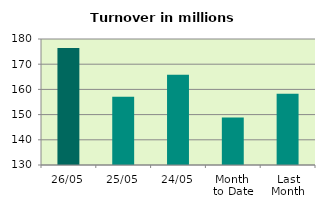
| Category | Series 0 |
|---|---|
| 26/05 | 176.399 |
| 25/05 | 157.109 |
| 24/05 | 165.846 |
| Month 
to Date | 148.85 |
| Last
Month | 158.303 |